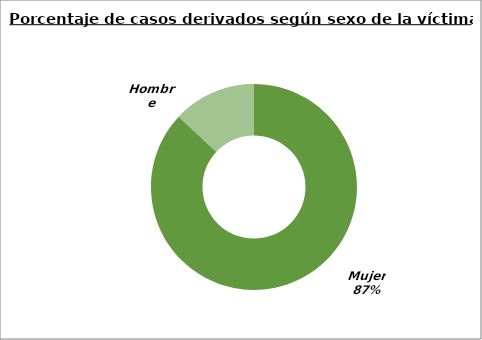
| Category | Series 0 |
|---|---|
| Mujer  | 1420 |
| Hombre | 213 |